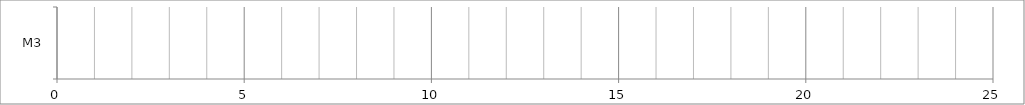
| Category | X | 0 | Series 6 | Series 7 |
|---|---|---|---|---|
| M3 | 0 | 0 |  |  |